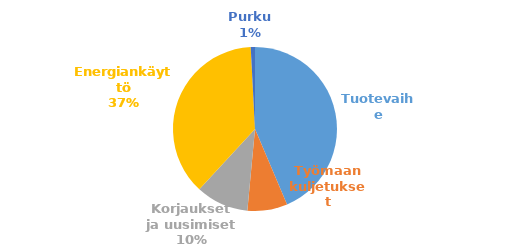
| Category | Series 0 |
|---|---|
| Tuotevaihe | 520 |
| Työmaan kuljetukset | 94 |
| Korjaukset ja uusimiset | 123.8 |
| Energiankäyttö | 444.57 |
| Purku | 10 |